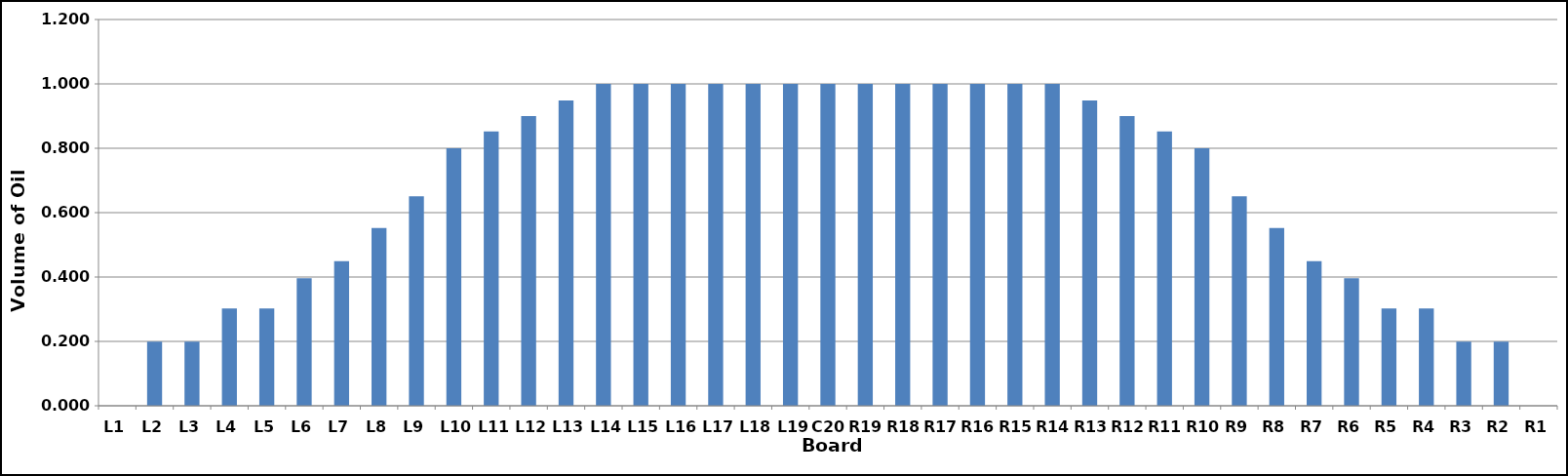
| Category | Series 0 |
|---|---|
| L1 | 0 |
| L2 | 0.2 |
| L3 | 0.2 |
| L4 | 0.303 |
| L5 | 0.303 |
| L6 | 0.396 |
| L7 | 0.449 |
| L8 | 0.552 |
| L9 | 0.651 |
| L10 | 0.8 |
| L11 | 0.853 |
| L12 | 0.9 |
| L13 | 0.949 |
| L14 | 1 |
| L15 | 1 |
| L16 | 1 |
| L17 | 1 |
| L18 | 1 |
| L19 | 1 |
| C20 | 1 |
| R19 | 1 |
| R18 | 1 |
| R17 | 1 |
| R16 | 1 |
| R15 | 1 |
| R14 | 1 |
| R13 | 0.949 |
| R12 | 0.9 |
| R11 | 0.853 |
| R10 | 0.8 |
| R9 | 0.651 |
| R8 | 0.552 |
| R7 | 0.449 |
| R6 | 0.396 |
| R5 | 0.303 |
| R4 | 0.303 |
| R3 | 0.2 |
| R2 | 0.2 |
| R1 | 0 |